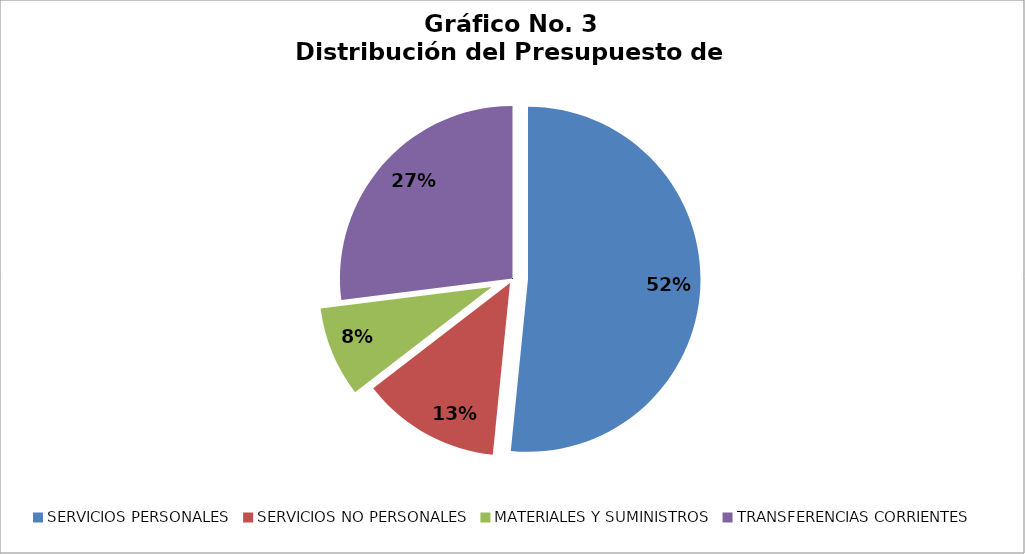
| Category | Series 0 |
|---|---|
| SERVICIOS PERSONALES | 344189 |
| SERVICIOS NO PERSONALES | 86569 |
| MATERIALES Y SUMINISTROS | 56300 |
| TRANSFERENCIAS CORRIENTES | 180100 |